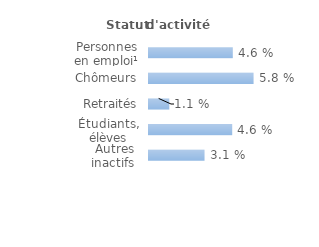
| Category | Series 0 |
|---|---|
| Personnes en emploi¹ | 0.046 |
| Chômeurs | 0.058 |
| Retraités | 0.011 |
| Étudiants, élèves | 0.046 |
| Autres inactifs  | 0.031 |